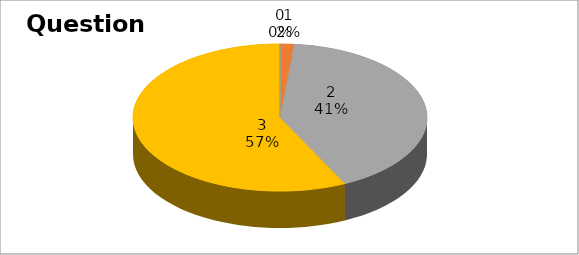
| Category | Series 0 |
|---|---|
| 0 | 0 |
| 1 | 2 |
| 2 | 54 |
| 3 | 75 |